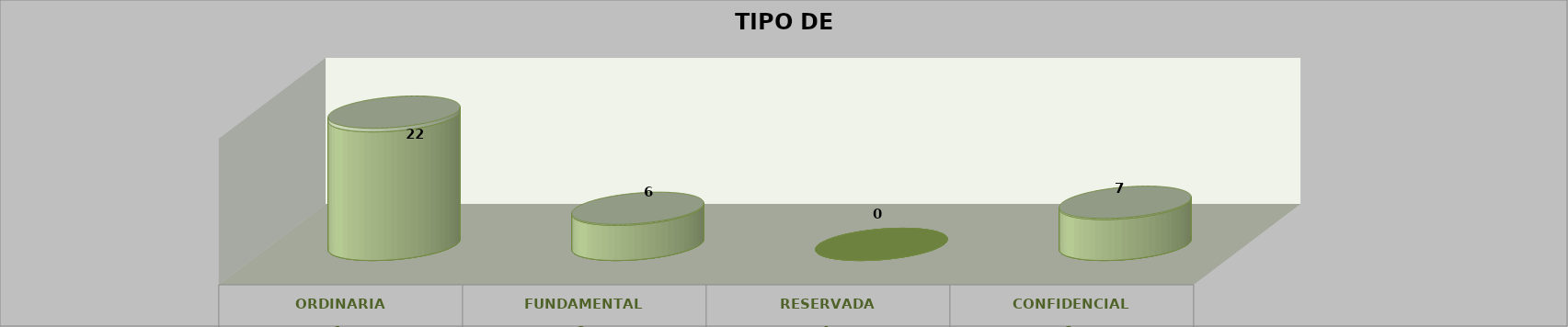
| Category | Series 0 | Series 2 | Series 1 | Series 3 | Series 4 |
|---|---|---|---|---|---|
| 0 |  |  |  | 22 | 0.629 |
| 1 |  |  |  | 6 | 0.171 |
| 2 |  |  |  | 0 | 0 |
| 3 |  |  |  | 7 | 0.2 |